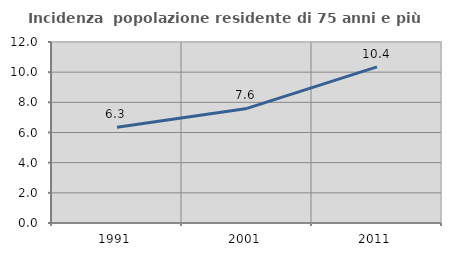
| Category | Incidenza  popolazione residente di 75 anni e più |
|---|---|
| 1991.0 | 6.347 |
| 2001.0 | 7.596 |
| 2011.0 | 10.351 |